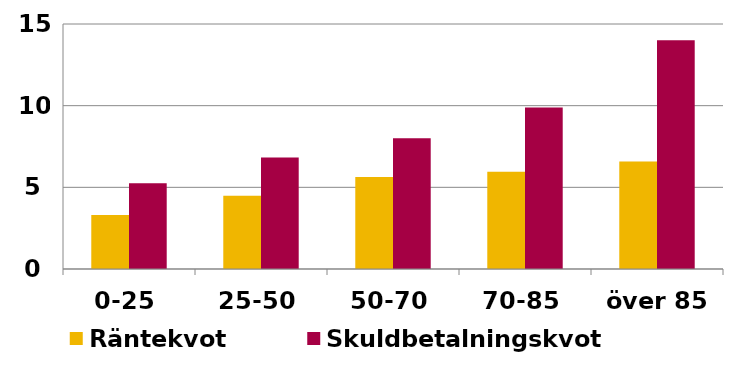
| Category | Räntekvot | Skuldbetalningskvot |
|---|---|---|
| 0-25 | 3.31 | 5.253 |
| 25-50 | 4.485 | 6.823 |
| 50-70 | 5.631 | 8.004 |
| 70-85 | 5.95 | 9.893 |
| över 85 | 6.588 | 14.003 |